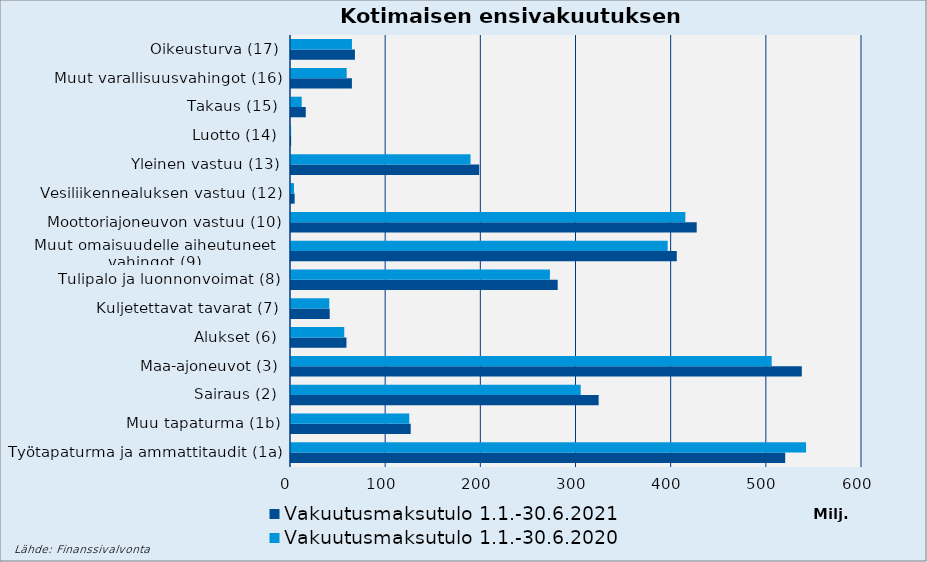
| Category | Vakuutusmaksutulo |
|---|---|
| Työtapaturma ja ammattitaudit (1a) | 541248.679 |
| Muu tapaturma (1b) | 124304.525 |
| Sairaus (2) | 304411.718 |
| Maa-ajoneuvot (3) | 505089.273 |
| Alukset (6) | 55968.274 |
| Kuljetettavat tavarat (7) | 40217.75 |
| Tulipalo ja luonnonvoimat (8) | 272045.371 |
| Muut omaisuudelle aiheutuneet 
vahingot (9) | 395813.817 |
| Moottoriajoneuvon vastuu (10) | 414358.803 |
| Vesiliikennealuksen vastuu (12) | 3126.74 |
| Yleinen vastuu (13) | 188654.525 |
| Luotto (14) | 130.491 |
| Takaus (15) | 11280.655 |
| Muut varallisuusvahingot (16) | 58524.778 |
| Oikeusturva (17) | 64048.359 |